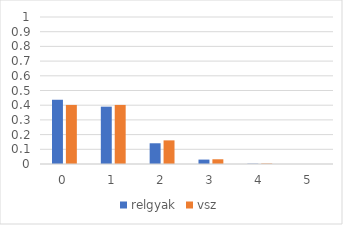
| Category | relgyak | vsz |
|---|---|---|
| 0.0 | 0.437 | 0.402 |
| 1.0 | 0.39 | 0.402 |
| 2.0 | 0.141 | 0.161 |
| 3.0 | 0.03 | 0.032 |
| 4.0 | 0.002 | 0.003 |
| 5.0 | 0 | 0 |